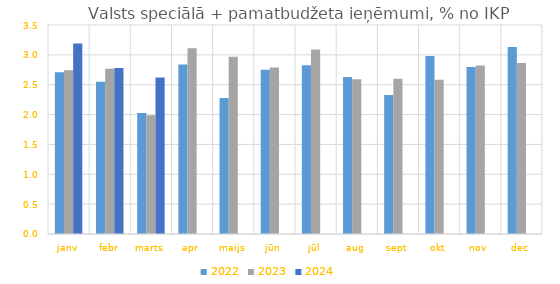
| Category | 2022 | 2023 | 2024 |
|---|---|---|---|
| janv | 2.711 | 2.743 | 3.192 |
| febr | 2.551 | 2.769 | 2.778 |
| marts | 2.028 | 1.989 | 2.619 |
| apr | 2.838 | 3.109 | 0 |
| maijs | 2.276 | 2.967 | 0 |
| jūn | 2.752 | 2.79 | 0 |
| jūl | 2.826 | 3.091 | 0 |
| aug | 2.63 | 2.59 | 0 |
| sept | 2.33 | 2.599 | 0 |
| okt | 2.981 | 2.584 | 0 |
| nov | 2.795 | 2.821 | 0 |
| dec | 3.131 | 2.863 | 0 |